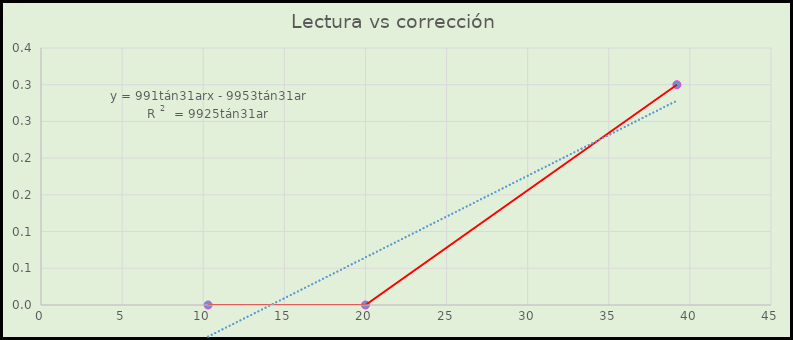
| Category | Corrección °C |
|---|---|
| 10.3 | 0 |
| 20.0 | 0 |
| 39.2 | 0.3 |